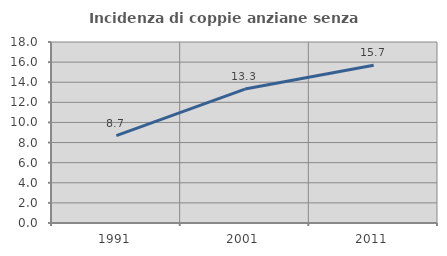
| Category | Incidenza di coppie anziane senza figli  |
|---|---|
| 1991.0 | 8.686 |
| 2001.0 | 13.319 |
| 2011.0 | 15.681 |